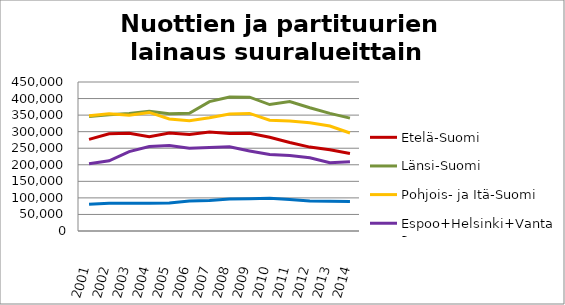
| Category | Etelä-Suomi | Länsi-Suomi | Pohjois- ja Itä-Suomi | Espoo+Helsinki+Vantaa | Muu Uusimaa |
|---|---|---|---|---|---|
| 2001.0 | 276870 | 345583 | 348039 | 203291 | 80780 |
| 2002.0 | 293464 | 351341 | 353898 | 212071 | 84036 |
| 2003.0 | 295241 | 354881 | 349883 | 239828 | 83748 |
| 2004.0 | 285010 | 361809 | 358075 | 255276 | 84153 |
| 2005.0 | 295975 | 354038 | 338399 | 258486 | 84668 |
| 2006.0 | 291662 | 355400 | 333317 | 250231 | 90834 |
| 2007.0 | 299093 | 390848 | 342041 | 252109 | 92291 |
| 2008.0 | 294136 | 404419 | 353269 | 254145 | 96985 |
| 2009.0 | 294969 | 404180 | 355210 | 241883 | 97738 |
| 2010.0 | 282877 | 381824 | 334696 | 230933 | 98641 |
| 2011.0 | 267180 | 390932 | 332436 | 227810 | 95120 |
| 2012.0 | 253394 | 372287 | 327188 | 221202 | 90878 |
| 2013.0 | 245127 | 355154 | 317011 | 206378 | 90064 |
| 2014.0 | 234208 | 340797 | 295976 | 209121 | 89464 |